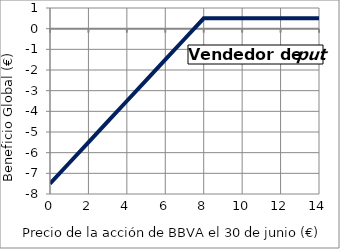
| Category | Comprador |
|---|---|
| 0.0 | -7.5 |
| 1.0 | -6.5 |
| 2.0 | -5.5 |
| 3.0 | -4.5 |
| 4.0 | -3.5 |
| 5.0 | -2.5 |
| 6.0 | -1.5 |
| 7.0 | -0.5 |
| 8.0 | 0.5 |
| 9.0 | 0.5 |
| 10.0 | 0.5 |
| 11.0 | 0.5 |
| 12.0 | 0.5 |
| 13.0 | 0.5 |
| 14.0 | 0.5 |